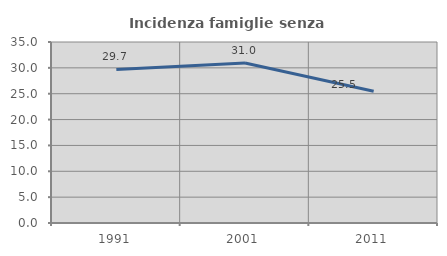
| Category | Incidenza famiglie senza nuclei |
|---|---|
| 1991.0 | 29.703 |
| 2001.0 | 30.952 |
| 2011.0 | 25.461 |